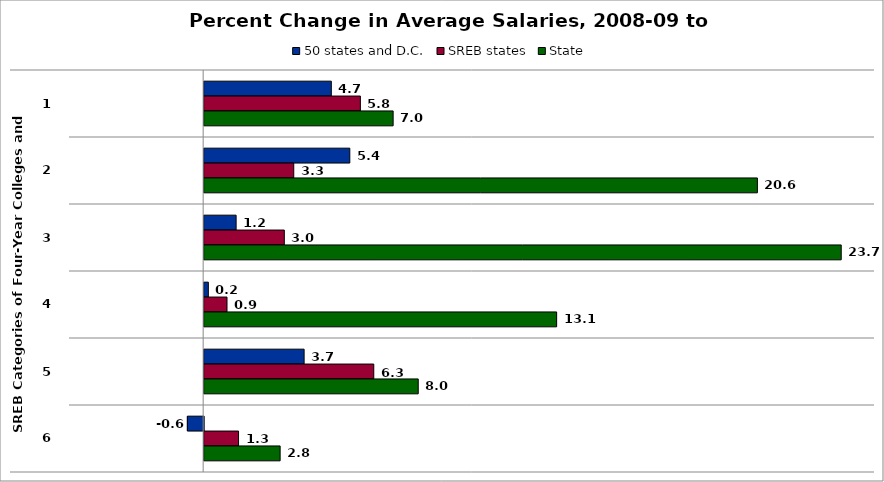
| Category | 50 states and D.C. | SREB states | State |
|---|---|---|---|
| 0 | 4.739 | 5.822 | 7.042 |
| 1 | 5.427 | 3.339 | 20.617 |
| 2 | 1.191 | 2.987 | 23.741 |
| 3 | 0.156 | 0.851 | 13.136 |
| 4 | 3.725 | 6.321 | 7.978 |
| 5 | -0.607 | 1.281 | 2.831 |